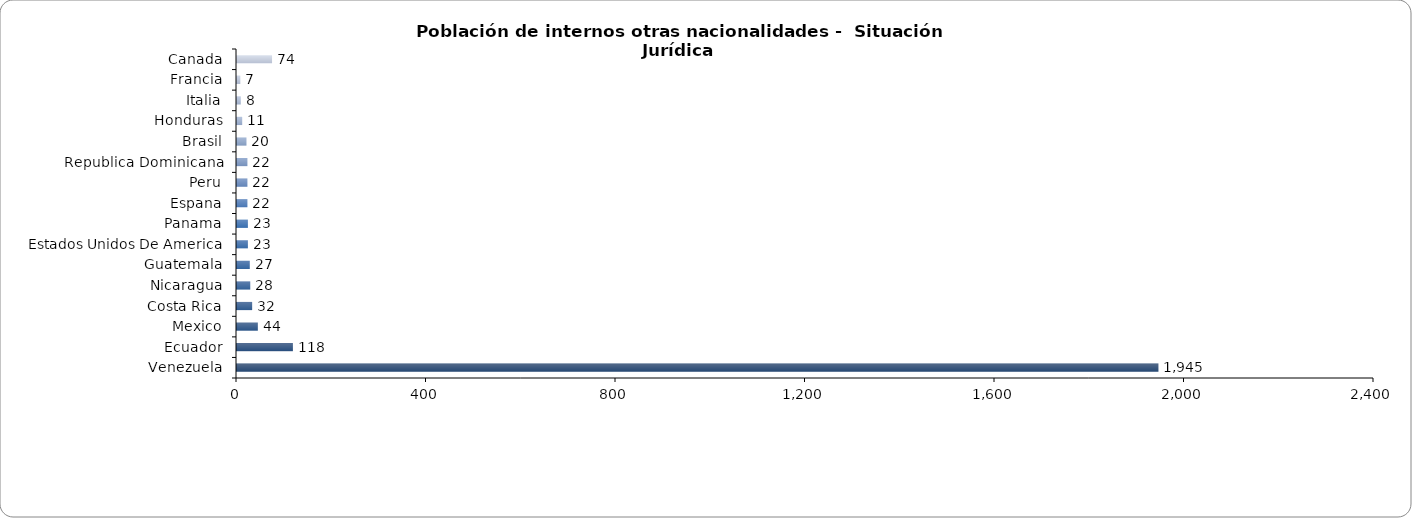
| Category | Series 0 |
|---|---|
| Venezuela | 1945 |
| Ecuador | 118 |
| Mexico | 44 |
| Costa Rica | 32 |
| Nicaragua | 28 |
| Guatemala | 27 |
| Estados Unidos De America | 23 |
| Panama | 23 |
| Espana | 22 |
| Peru | 22 |
| Republica Dominicana | 22 |
| Brasil | 20 |
| Honduras | 11 |
| Italia | 8 |
| Francia | 7 |
| Canada | 74 |